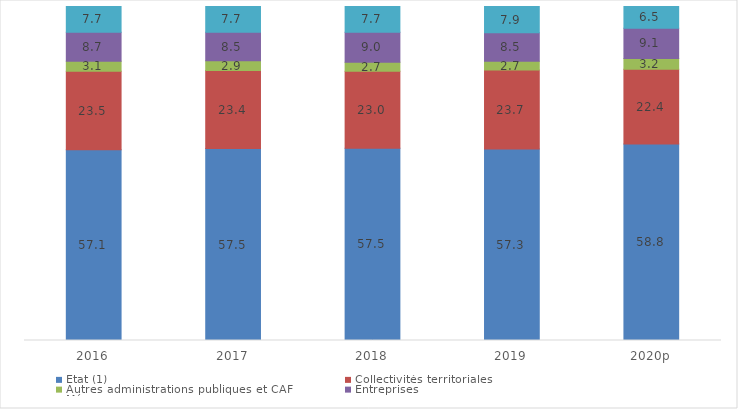
| Category | État (1) | Collectivités territoriales | Autres administrations publiques et CAF | Entreprises | Ménages  |
|---|---|---|---|---|---|
| 2016 | 57.103 | 23.475 | 3.063 | 8.667 | 7.692 |
| 2017 | 57.481 | 23.361 | 2.883 | 8.537 | 7.738 |
| 2018 | 57.546 | 23.041 | 2.71 | 8.971 | 7.732 |
| 2019 | 57.306 | 23.659 | 2.678 | 8.483 | 7.874 |
| 2020p | 58.814 | 22.414 | 3.193 | 9.104 | 6.475 |